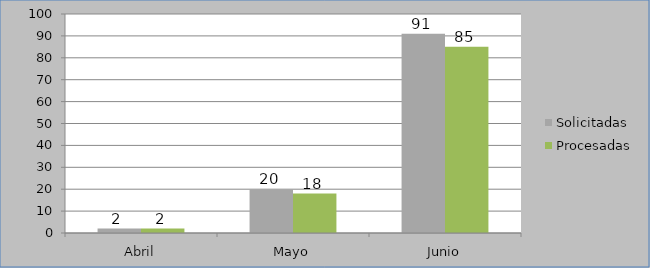
| Category | Solicitadas | Procesadas |
|---|---|---|
| Abril | 2 | 2 |
| Mayo | 20 | 18 |
| Junio | 91 | 85 |